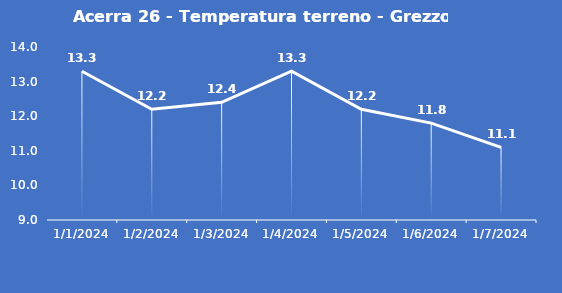
| Category | Acerra 26 - Temperatura terreno - Grezzo (°C) |
|---|---|
| 1/1/24 | 13.3 |
| 1/2/24 | 12.2 |
| 1/3/24 | 12.4 |
| 1/4/24 | 13.3 |
| 1/5/24 | 12.2 |
| 1/6/24 | 11.8 |
| 1/7/24 | 11.1 |